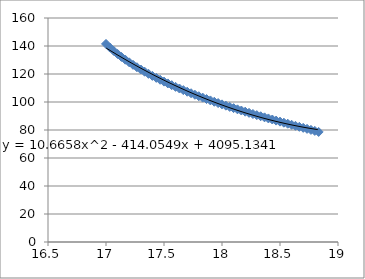
| Category | Series 0 |
|---|---|
| 17.0 | 141.495 |
| 17.033333333333335 | 138.897 |
| 17.066666666666666 | 136.503 |
| 17.1 | 134.275 |
| 17.133333333333333 | 132.183 |
| 17.166666666666668 | 130.208 |
| 17.2 | 128.333 |
| 17.233333333333334 | 126.548 |
| 17.266666666666666 | 124.842 |
| 17.3 | 123.205 |
| 17.333333333333332 | 121.633 |
| 17.366666666666667 | 120.12 |
| 17.4 | 118.658 |
| 17.433333333333334 | 117.247 |
| 17.466666666666665 | 115.88 |
| 17.5 | 114.555 |
| 17.533333333333335 | 113.27 |
| 17.566666666666666 | 112.022 |
| 17.6 | 110.808 |
| 17.633333333333333 | 109.627 |
| 17.666666666666668 | 108.475 |
| 17.7 | 107.352 |
| 17.733333333333334 | 106.257 |
| 17.766666666666666 | 105.187 |
| 17.8 | 104.14 |
| 17.833333333333332 | 103.117 |
| 17.866666666666667 | 102.115 |
| 17.9 | 101.135 |
| 17.933333333333334 | 100.173 |
| 17.966666666666665 | 99.23 |
| 18.0 | 98.305 |
| 18.033333333333335 | 97.395 |
| 18.066666666666666 | 96.502 |
| 18.1 | 95.623 |
| 18.133333333333333 | 94.76 |
| 18.166666666666668 | 93.908 |
| 18.2 | 93.07 |
| 18.233333333333334 | 92.243 |
| 18.266666666666666 | 91.427 |
| 18.3 | 90.622 |
| 18.333333333333332 | 89.827 |
| 18.366666666666667 | 89.04 |
| 18.4 | 88.262 |
| 18.433333333333334 | 87.492 |
| 18.466666666666665 | 86.728 |
| 18.5 | 85.972 |
| 18.533333333333335 | 85.222 |
| 18.566666666666666 | 84.477 |
| 18.6 | 83.735 |
| 18.633333333333333 | 82.998 |
| 18.666666666666668 | 82.265 |
| 18.7 | 81.535 |
| 18.733333333333334 | 80.807 |
| 18.766666666666666 | 80.078 |
| 18.8 | 79.353 |
| 18.833333333333332 | 78.627 |